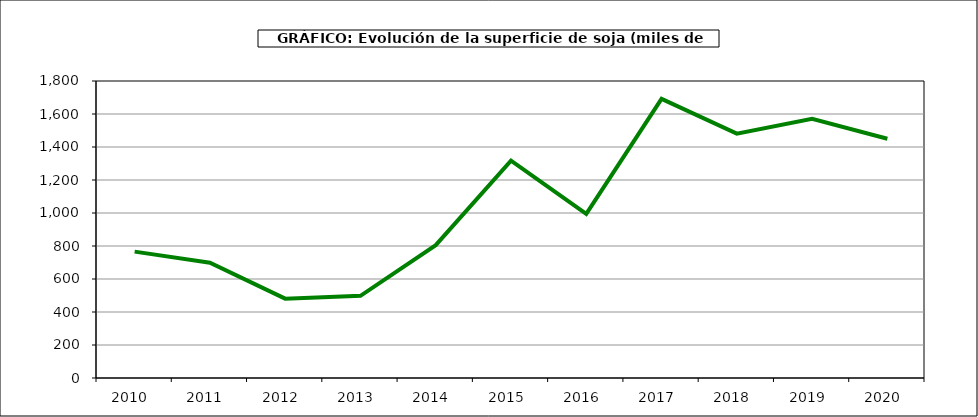
| Category | Superficie |
|---|---|
| 2010.0 | 766 |
| 2011.0 | 699 |
| 2012.0 | 481 |
| 2013.0 | 498 |
| 2014.0 | 805 |
| 2015.0 | 1317 |
| 2016.0 | 995 |
| 2017.0 | 1692 |
| 2018.0 | 1481 |
| 2019.0 | 1571 |
| 2020.0 | 1450 |